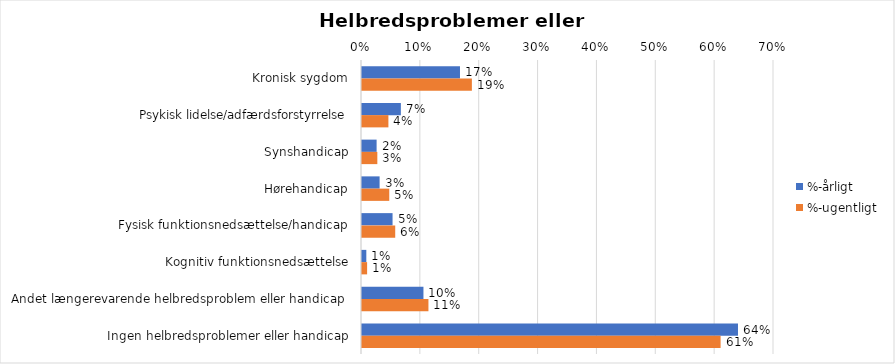
| Category | %-årligt | %-ugentligt |
|---|---|---|
| Kronisk sygdom | 0.166 | 0.187 |
| Psykisk lidelse/adfærdsforstyrrelse | 0.066 | 0.045 |
| Synshandicap | 0.025 | 0.026 |
| Hørehandicap | 0.03 | 0.046 |
| Fysisk funktionsnedsættelse/handicap | 0.052 | 0.056 |
| Kognitiv funktionsnedsættelse | 0.007 | 0.009 |
| Andet længerevarende helbredsproblem eller handicap  | 0.104 | 0.113 |
| Ingen helbredsproblemer eller handicap | 0.639 | 0.609 |